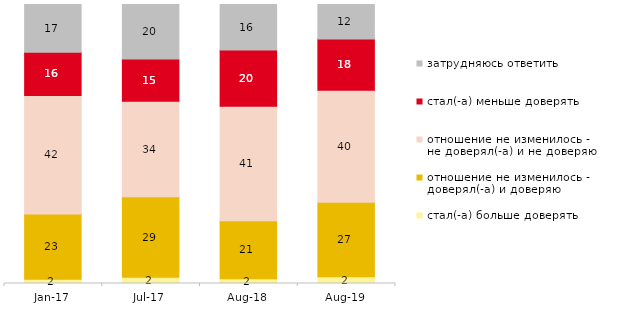
| Category | стал(-а) больше доверять | отношение не изменилось - 
доверял(-а) и доверяю | отношение не изменилось - 
не доверял(-а) и не доверяю | стал(-а) меньше доверять | затрудняюсь ответить |
|---|---|---|---|---|---|
| 2017-01-01 | 1.55 | 23.35 | 42.45 | 15.55 | 17.1 |
| 2017-07-01 | 2.2 | 28.85 | 34.3 | 15.15 | 19.5 |
| 2018-08-01 | 1.7 | 20.8 | 41.05 | 20.1 | 16.35 |
| 2019-08-01 | 2.398 | 26.723 | 40.11 | 18.432 | 12.338 |